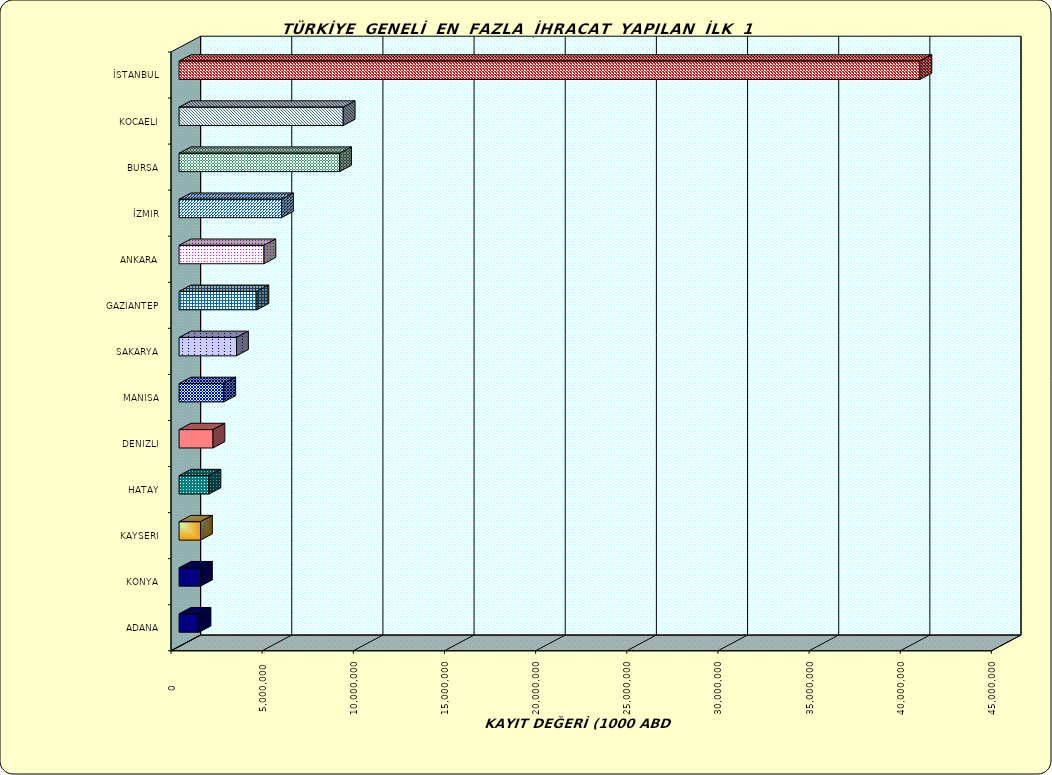
| Category | Series 0 |
|---|---|
| İSTANBUL | 40638138.178 |
| KOCAELI | 9003535.237 |
| BURSA | 8805378.927 |
| İZMIR | 5618580.379 |
| ANKARA | 4656994.839 |
| GAZIANTEP | 4271951.51 |
| SAKARYA | 3150626.346 |
| MANISA | 2451858.913 |
| DENIZLI | 1860869.557 |
| HATAY | 1639999.536 |
| KAYSERI | 1176279.564 |
| KONYA | 1175701.537 |
| ADANA | 1094763.314 |